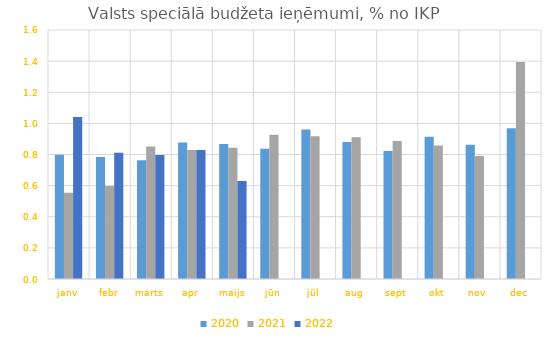
| Category | 2020 | 2021 | 2022 |
|---|---|---|---|
| janv | 0.798 | 0.554 | 1.042 |
| febr | 0.784 | 0.598 | 0.812 |
| marts | 0.763 | 0.851 | 0.796 |
| apr | 0.877 | 0.829 | 0.828 |
| maijs | 0.868 | 0.843 | 0.629 |
| jūn | 0.838 | 0.927 | 0 |
| jūl | 0.961 | 0.918 | 0 |
| aug | 0.88 | 0.911 | 0 |
| sept | 0.822 | 0.887 | 0 |
| okt | 0.913 | 0.858 | 0 |
| nov | 0.863 | 0.79 | 0 |
| dec | 0.969 | 1.394 | 0 |